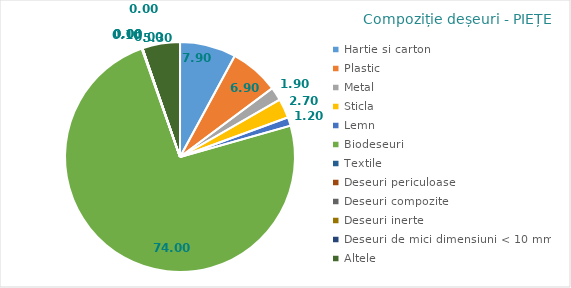
| Category | Series 0 | Series 1 |
|---|---|---|
| Hartie si carton | 7.9 |  |
| Plastic | 6.9 |  |
| Metal | 1.9 |  |
| Sticla | 2.7 |  |
| Lemn | 1.2 |  |
| Biodeseuri | 74 |  |
| Textile | 0.1 |  |
| Deseuri periculoase | 0 |  |
| Deseuri compozite | 0 |  |
| Deseuri inerte | 0 |  |
| Deseuri de mici dimensiuni < 10 mm | 0 |  |
| Altele | 5.3 |  |